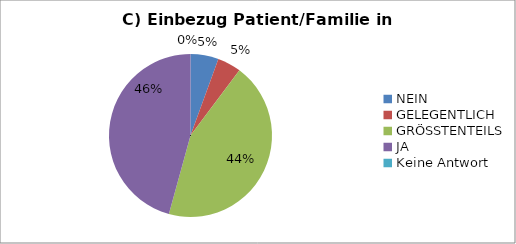
| Category | Series 0 |
|---|---|
| NEIN | 13 |
| GELEGENTLICH | 11 |
| GRÖSSTENTEILS | 103 |
| JA | 107 |
| Keine Antwort | 0 |